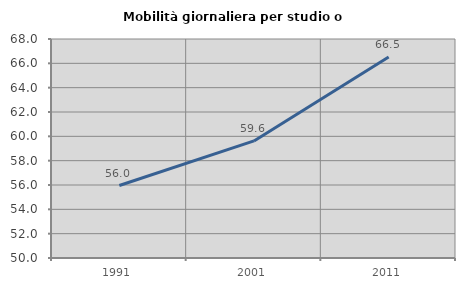
| Category | Mobilità giornaliera per studio o lavoro |
|---|---|
| 1991.0 | 55.955 |
| 2001.0 | 59.623 |
| 2011.0 | 66.527 |